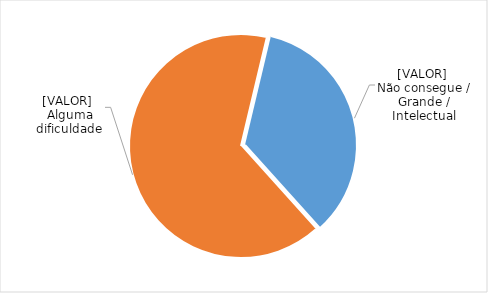
| Category | Series 0 |
|---|---|
| Alguma dificuldade | 29831965 |
| Não consegue / Grande / Intelectual | 15791945 |